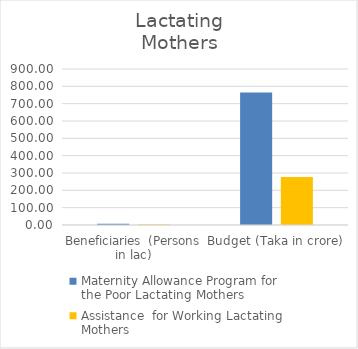
| Category | Maternity Allowance Program for
the Poor Lactating Mothers | Assistance  for Working Lactating
Mothers |
|---|---|---|
| Beneficiaries  (Persons in lac) | 7.7 | 2.75 |
| Budget (Taka in crore) | 764.39 | 276.65 |